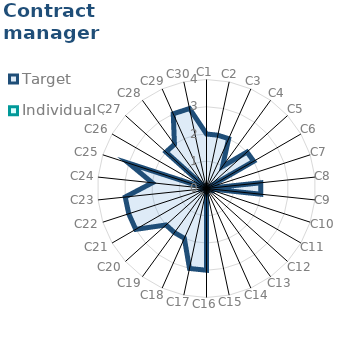
| Category | Target | Individual 3 |
|---|---|---|
| C1 | 2 | 0 |
| C2 | 2 | 0 |
| C3 | 2 | 0 |
| C4 | 1 | 0 |
| C5 | 2 | 0 |
| C6 | 2 | 0 |
| C7 | 0 | 0 |
| C8 | 2 | 0 |
| C9 | 2 | 0 |
| C10 | 0 | 0 |
| C11 | 0 | 0 |
| C12 | 0 | 0 |
| C13 | 0 | 0 |
| C14 | 0 | 0 |
| C15 | 0 | 0 |
| C16 | 3 | 0 |
| C17 | 3 | 0 |
| C18 | 2 | 0 |
| C19 | 2 | 0 |
| C20 | 2 | 0 |
| C21 | 3 | 0 |
| C22 | 3 | 0 |
| C23 | 3 | 0 |
| C24 | 2 | 0 |
| C25 | 3 | 0 |
| C26 | 0 | 0 |
| C27 | 2 | 0 |
| C28 | 2 | 0 |
| C29 | 3 | 0 |
| C30 | 3 | 0 |